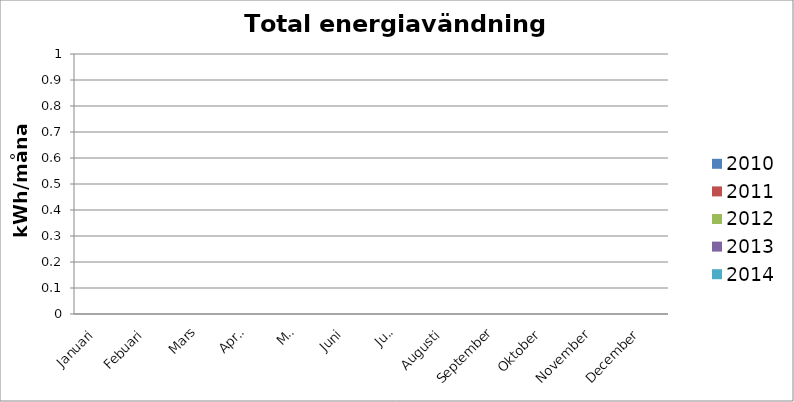
| Category | 2010 | 2011 | 2012 | 2013 | 2014 |
|---|---|---|---|---|---|
| Januari | 0 | 0 | 0 | 0 | 0 |
| Febuari | 0 | 0 | 0 | 0 | 0 |
| Mars | 0 | 0 | 0 | 0 | 0 |
| April | 0 | 0 | 0 | 0 | 0 |
| Maj | 0 | 0 | 0 | 0 | 0 |
| Juni | 0 | 0 | 0 | 0 | 0 |
| Juli | 0 | 0 | 0 | 0 | 0 |
| Augusti | 0 | 0 | 0 | 0 | 0 |
| September | 0 | 0 | 0 | 0 | 0 |
| Oktober | 0 | 0 | 0 | 0 | 0 |
| November | 0 | 0 | 0 | 0 | 0 |
| December | 0 | 0 | 0 | 0 | 0 |